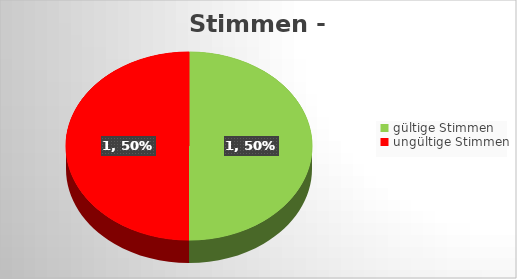
| Category | Series 0 |
|---|---|
| gültige Stimmen | 1 |
| ungültige Stimmen | 1 |